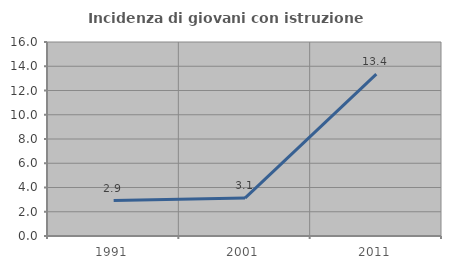
| Category | Incidenza di giovani con istruzione universitaria |
|---|---|
| 1991.0 | 2.927 |
| 2001.0 | 3.125 |
| 2011.0 | 13.352 |